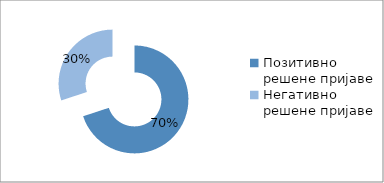
| Category | Series 0 |
|---|---|
| Позитивно решене пријаве | 9262 |
| Негативно решене пријаве | 3979 |